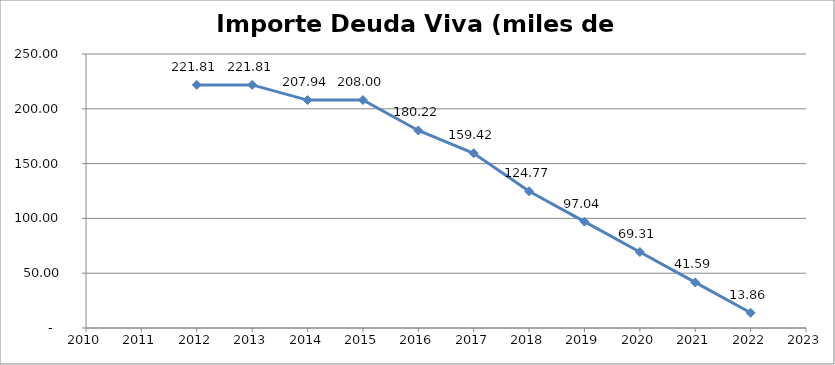
| Category | Importe deuda viva (miles de €) |
|---|---|
| 2012.0 | 221.806 |
| 2013.0 | 221.806 |
| 2014.0 | 207.943 |
| 2015.0 | 208 |
| 2016.0 | 180.218 |
| 2017.0 | 159.423 |
| 2018.0 | 124.766 |
| 2019.0 | 97.04 |
| 2020.0 | 69.315 |
| 2021.0 | 41.589 |
| 2022.0 | 13.863 |